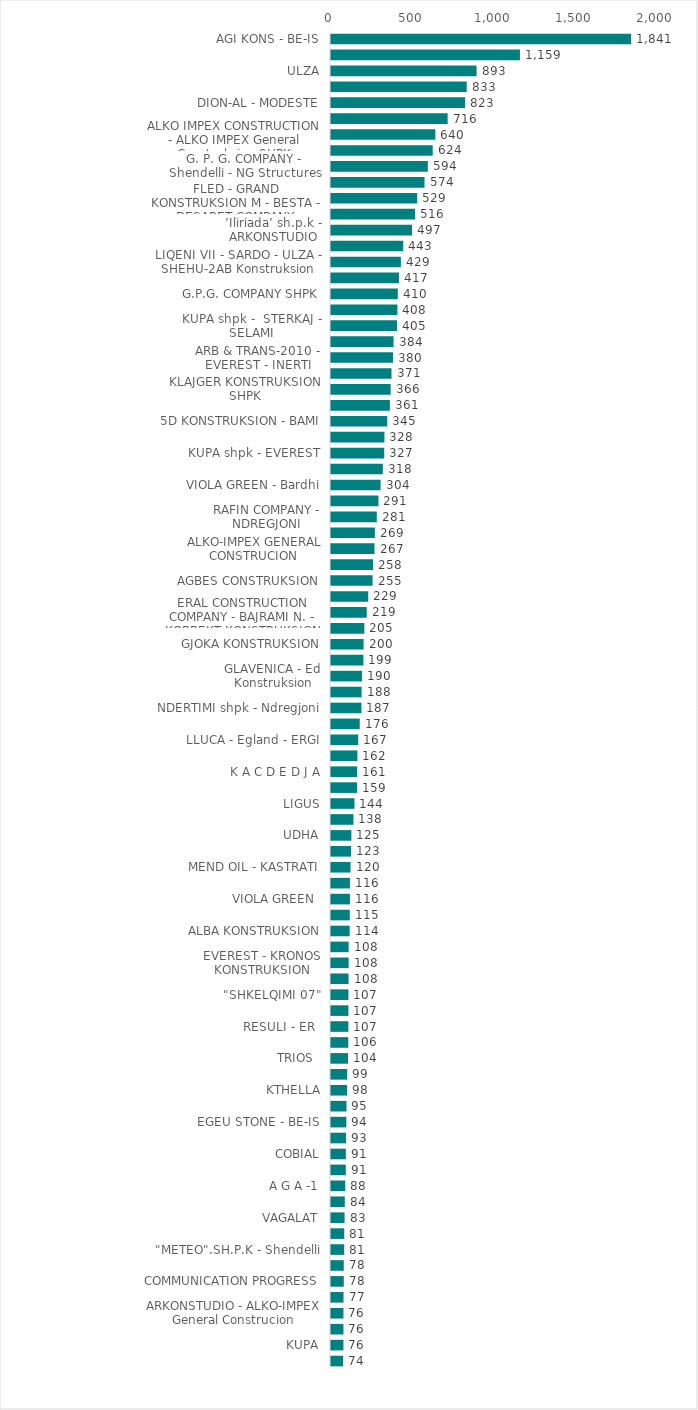
| Category | Vlera e fituesit pa TVSH (Lekë) |
|---|---|
| AGI KONS - BE-IS | 1840.784 |
| NOVA  CONSTRUCTION 2012 - Ante-Group | 1159.123 |
| ULZA | 893.082 |
| ERGI - BE-IS | 832.699 |
| DION-AL - MODESTE | 822.753 |
| RAJLI NDERTIM - G. P. G. COMPANY | 715.64 |
| ALKO IMPEX CONSTRUCTION - ALKO IMPEX General Construksion SHPK | 640.3 |
| Inerti SHPK	 | 623.935 |
| G. P. G. COMPANY - Shendelli - NG Structures | 594.114 |
| LA - OR | 573.761 |
| FLED - GRAND KONSTRUKSION M - BESTA - DESARET COMPANY | 528.844 |
| 4 A-M | 515.781 |
| ’Iliriada’ sh.p.k - ARKONSTUDIO | 497.093 |
| G.P.G. COMPANY - LLAZO | 443.329 |
| LIQENI VII - SARDO - ULZA - SHEHU-2AB Konstruksion | 428.529 |
| EURONDERTIMI 2000 - K.A.E.XH - ALMO KONSTRUKSION - EVEREST | 416.862 |
| G.P.G. COMPANY SHPK | 409.899 |
| ERAL CONSTRUCTION COMPANY - BAJRAMI N. - STERKAJ | 407.525 |
| KUPA shpk -  STERKAJ - SELAMI | 404.772 |
| VALONA KONSTRUKSION - NDREGJONI | 383.739 |
| ARB & TRANS-2010 - EVEREST - INERTI | 380.257 |
| S I R E T A  2F | 371.175 |
| KLAJGER KONSTRUKSION SHPK | 365.837 |
| BESTA - LLAZO - ARKONSTUDIO | 361.264 |
| 5D KONSTRUKSION - BAMI | 345.1 |
| KUPA  - "PE - VLA - KU" - UDHA | 327.91 |
| KUPA shpk - EVEREST | 326.668 |
| ARB & TRANS-2010” sh.p.k - EVEREST | 317.88 |
| VIOLA GREEN - Bardhi | 304.164 |
| KASTRATI
 | 291.274 |
| RAFIN COMPANY - NDREGJONI | 281 |
| KUPA - UDHA | 269.065 |
| ALKO-IMPEX GENERAL CONSTRUCION | 266.88 |
| SHENDELLI SHPK - TOTILA - NET-GROUP | 258 |
| AGBES CONSTRUKSION | 254.886 |
| FUSHA - Edil-al-it | 228.511 |
| ERAL CONSTRUCTION COMPANY - BAJRAMI N. - KORREKT KONSTRUKSION | 219.187 |
| BAJRAMI N. | 204.572 |
| GJOKA KONSTRUKSION | 199.992 |
| UDHA - NDREGJONI | 198.979 |
| GLAVENICA - Ed Konstruksion | 189.879 |
| VELLEZERIT HYSA | 187.755 |
| NDERTIMI shpk - Ndregjoni | 186.847 |
| EURONDERTIMI 2000 | 176.328 |
| LLUCA - Egland - ERGI | 166.956 |
| ALMO KONSTRUKSION | 162.161 |
| K A C D E D J A | 160.618 |
| ERGI | 159.373 |
| LIGUS | 143.887 |
| ZDRAVO - ARENA MK | 137.82 |
| UDHA | 125.066 |
| ALB SHPRESA - MELA | 122.777 |
| MEND OIL - KASTRATI | 120 |
| REJ | 116.248 |
| VIOLA GREEN
 | 116.056 |
| BABASI COO - KLAJGER KONSTRUKSION | 115.252 |
| ALBA KONSTRUKSION | 114.482 |
| VALONA KONSTRUKSION | 108.363 |
| EVEREST - KRONOS KONSTRUKSION | 108.359 |
| SALILLARI | 107.668 |
| "SHKELQIMI 07" | 107 |
| NG STRUCTURES - METEO | 106.821 |
| RESULI - ER
 | 106.575 |
| CURRI | 106.043 |
| TRIOS
 | 104.354 |
| BALILI  KONSTRUKSION - I.D.K - KONSTRUKSION | 99.321 |
| KTHELLA | 98.029 |
| A G S
 | 95.074 |
| EGEU STONE - BE-IS | 94.182 |
| MODESTE - ED KONSTRUKSION - VIANTE Konstruksion | 92.628 |
| COBIAL | 91.249 |
| RESULI-ER - KASTRATI | 90.881 |
| A G A -1 | 87.561 |
| BETA shpk - G.P.G. COMPANY SHPK | 84.422 |
| VAGALAT | 83.241 |
| I.C.C GROUP - BE-IS - MF INVEST GROUP | 81.376 |
| "METEO".SH.P.K - Shendelli | 81.051 |
| ERZENI/SH | 78.327 |
| COMMUNICATION PROGRESS | 78.209 |
| ERAL CONSTRUCTION COMPANY - BAJRAMI N. | 76.757 |
| ARKONSTUDIO - ALKO-IMPEX General Construcion | 76.499 |
| ALBAVIA | 76.477 |
| KUPA | 76.387 |
| START CO | 74.3 |